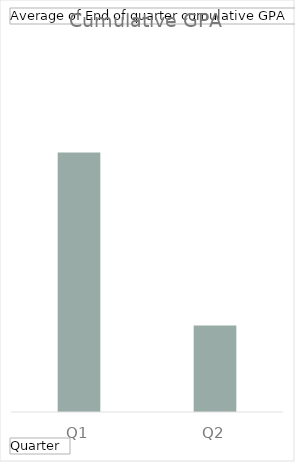
| Category | Total |
|---|---|
| Q1 | 3 |
| Q2 | 1 |